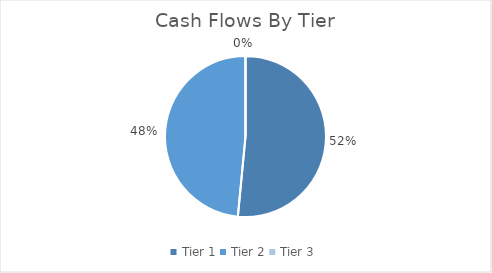
| Category | Series 0 |
|---|---|
| Tier 1 | 0.515 |
| Tier 2 | 0.485 |
| Tier 3 | 0 |